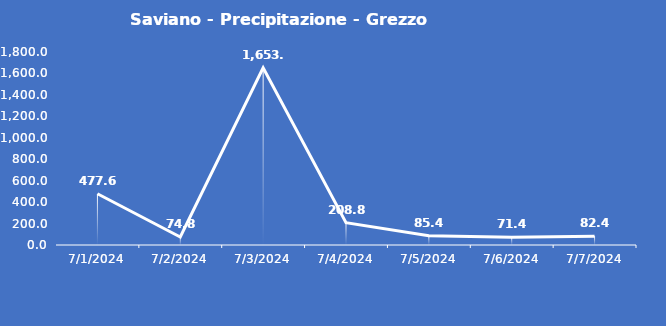
| Category | Saviano - Precipitazione - Grezzo (mm) |
|---|---|
| 7/1/24 | 477.6 |
| 7/2/24 | 74.8 |
| 7/3/24 | 1653.4 |
| 7/4/24 | 208.8 |
| 7/5/24 | 85.4 |
| 7/6/24 | 71.4 |
| 7/7/24 | 82.4 |